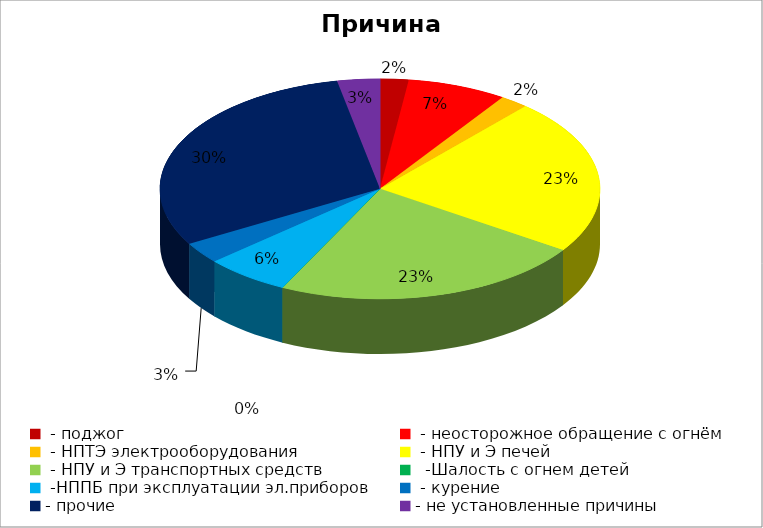
| Category | Причина пожара |
|---|---|
|  - поджог | 2 |
|  - неосторожное обращение с огнём | 7 |
|  - НПТЭ электрооборудования | 2 |
|  - НПУ и Э печей | 22 |
|  - НПУ и Э транспортных средств | 22 |
|   -Шалость с огнем детей | 0 |
|  -НППБ при эксплуатации эл.приборов | 6 |
|  - курение | 3 |
| - прочие | 29 |
| - не установленные причины | 3 |